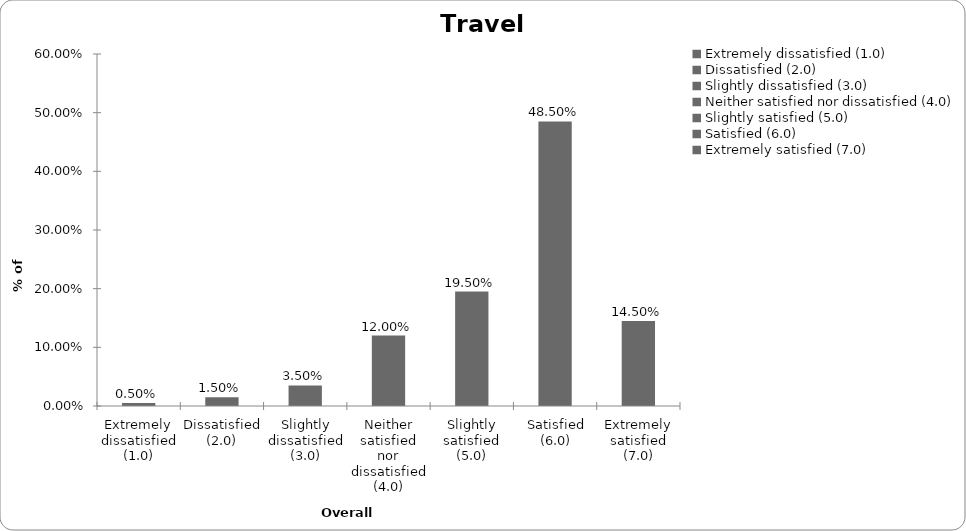
| Category | Series 0 |
|---|---|
| Extremely dissatisfied (1.0) | 0.005 |
| Dissatisfied (2.0) | 0.015 |
| Slightly dissatisfied (3.0) | 0.035 |
| Neither satisfied nor dissatisfied (4.0) | 0.12 |
| Slightly satisfied (5.0) | 0.195 |
| Satisfied (6.0) | 0.485 |
| Extremely satisfied (7.0) | 0.145 |